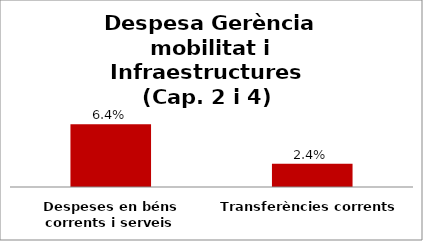
| Category | Series 0 |
|---|---|
| Despeses en béns corrents i serveis | 0.064 |
| Transferències corrents | 0.024 |